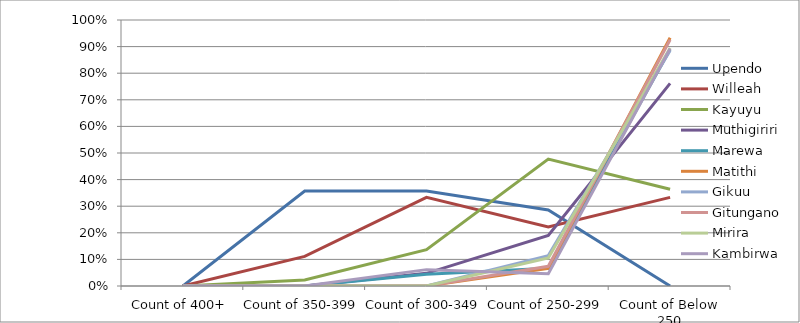
| Category | Upendo | Willeah | Kayuyu | Muthigiriri | Marewa | Matithi | Gikuu | Gitungano | Mirira | Kambirwa |
|---|---|---|---|---|---|---|---|---|---|---|
| Count of 400+ | 0 | 0 | 0 | 0 | 0 | 0 | 0 | 0 | 0 | 0 |
| Count of 350-399 | 0.357 | 0.111 | 0.023 | 0 | 0 | 0 | 0 | 0 | 0 | 0 |
| Count of 300-349 | 0.357 | 0.333 | 0.136 | 0.048 | 0.044 | 0 | 0 | 0 | 0 | 0.062 |
| Count of 250-299 | 0.286 | 0.222 | 0.477 | 0.19 | 0.067 | 0.067 | 0.114 | 0.074 | 0.105 | 0.046 |
| Count of Below 250 | 0 | 0.333 | 0.364 | 0.762 | 0.889 | 0.933 | 0.886 | 0.926 | 0.895 | 0.892 |